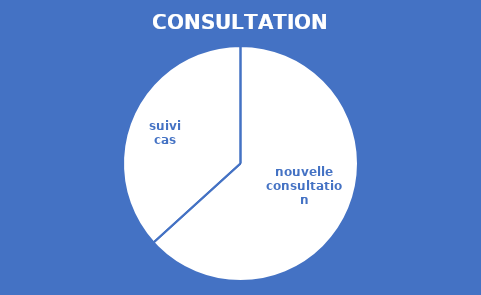
| Category | Series 0 |
|---|---|
| nouvelle consultation | 0.633 |
| suivi cas | 0.367 |